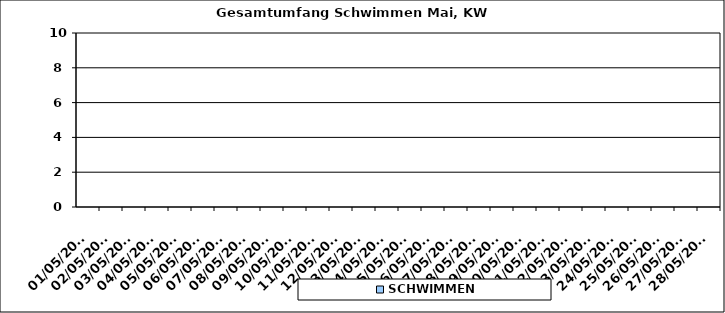
| Category | SCHWIMMEN |
|---|---|
| 01/05/2023 | 0 |
| 02/05/2023 | 0 |
| 03/05/2023 | 0 |
| 04/05/2023 | 0 |
| 05/05/2023 | 0 |
| 06/05/2023 | 0 |
| 07/05/2023 | 0 |
| 08/05/2023 | 0 |
| 09/05/2023 | 0 |
| 10/05/2023 | 0 |
| 11/05/2023 | 0 |
| 12/05/2023 | 0 |
| 13/05/2023 | 0 |
| 14/05/2023 | 0 |
| 15/05/2023 | 0 |
| 16/05/2023 | 0 |
| 17/05/2023 | 0 |
| 18/05/2023 | 0 |
| 19/05/2023 | 0 |
| 20/05/2023 | 0 |
| 21/05/2023 | 0 |
| 22/05/2023 | 0 |
| 23/05/2023 | 0 |
| 24/05/2023 | 0 |
| 25/05/2023 | 0 |
| 26/05/2023 | 0 |
| 27/05/2023 | 0 |
| 28/05/2023 | 0 |